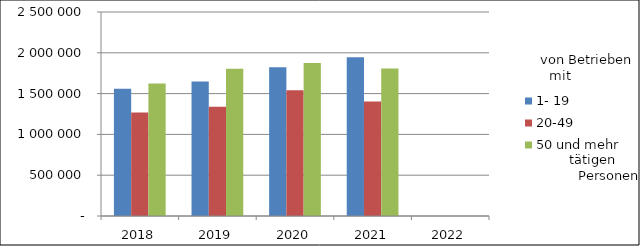
| Category | 1- 19 | 20-49 | 50 und mehr |
|---|---|---|---|
| 2018.0 | 1559767.804 | 1267721.312 | 1625033.088 |
| 2019.0 | 1648400.936 | 1337797.111 | 1803544.827 |
| 2020.0 | 1822443.621 | 1541387.368 | 1875679.649 |
| 2021.0 | 1945072.53 | 1404260.485 | 1806688.839 |
| 2022.0 | 0 | 0 | 0 |